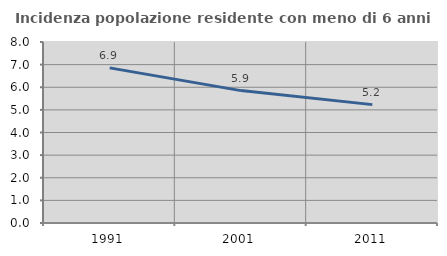
| Category | Incidenza popolazione residente con meno di 6 anni |
|---|---|
| 1991.0 | 6.856 |
| 2001.0 | 5.852 |
| 2011.0 | 5.232 |